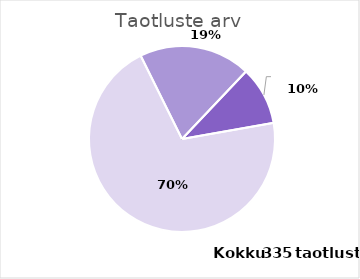
| Category | Taotluste arv |
|---|---|
| PRG | 236 |
| PSG | 65 |
| PUTJD | 34 |